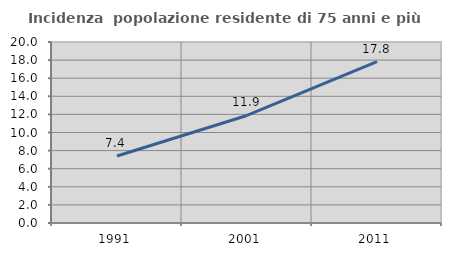
| Category | Incidenza  popolazione residente di 75 anni e più |
|---|---|
| 1991.0 | 7.398 |
| 2001.0 | 11.88 |
| 2011.0 | 17.839 |